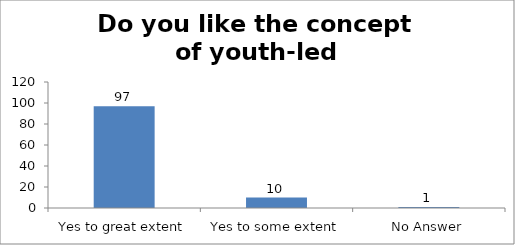
| Category | Do you like the concept of youth-led changemaking?  |
|---|---|
| Yes to great extent | 97 |
| Yes to some extent | 10 |
| No Answer | 1 |